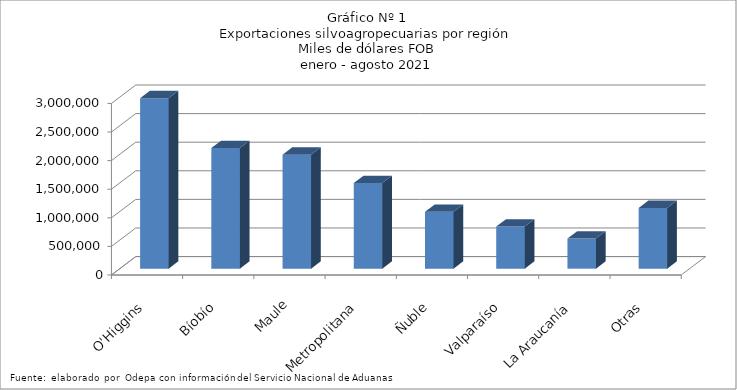
| Category | Series 0 |
|---|---|
| O'Higgins | 2981089.514 |
| Bíobío | 2109042.818 |
| Maule | 1993756.174 |
| Metropolitana | 1497565.984 |
| Ñuble | 994747.37 |
| Valparaíso | 735753.706 |
| La Araucanía | 527158.949 |
| Otras | 1062463.363 |